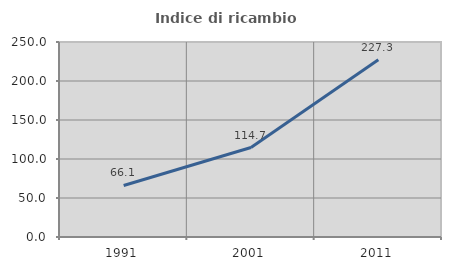
| Category | Indice di ricambio occupazionale  |
|---|---|
| 1991.0 | 66.08 |
| 2001.0 | 114.713 |
| 2011.0 | 227.273 |